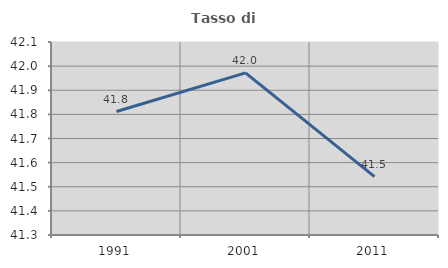
| Category | Tasso di occupazione   |
|---|---|
| 1991.0 | 41.812 |
| 2001.0 | 41.972 |
| 2011.0 | 41.542 |